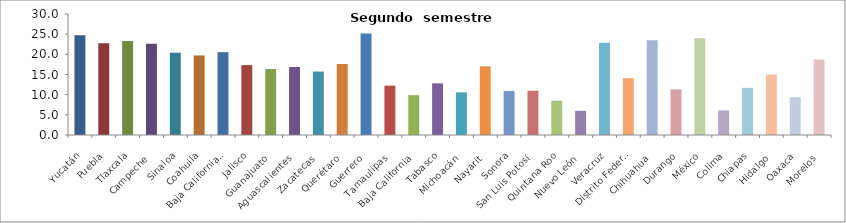
| Category | Segundo semestre 2010 |
|---|---|
| Yucatán | 24.72 |
| Puebla | 22.722 |
| Tlaxcala | 23.312 |
| Campeche | 22.621 |
| Sinaloa | 20.41 |
| Coahuila | 19.724 |
| Baja California Sur | 20.536 |
| Jalisco | 17.337 |
| Guanajuato | 16.345 |
| Aguascalientes | 16.853 |
| Zacatecas | 15.731 |
| Querétaro | 17.607 |
| Guerrero | 25.148 |
| Tamaulipas | 12.237 |
| Baja California | 9.879 |
| Tabasco | 12.805 |
| Michoacán | 10.573 |
| Nayarit | 17.029 |
| Sonora | 10.921 |
| San Luis Potosí | 10.984 |
| Quintana Roo | 8.518 |
| Nuevo León | 6.009 |
| Veracruz | 22.875 |
| Distrito Federal | 14.093 |
| Chihuahua | 23.49 |
| Durango | 11.305 |
| México | 24.006 |
| Colima | 6.099 |
| Chiapas | 11.705 |
| Hidalgo | 14.991 |
| Oaxaca | 9.378 |
| Morelos | 18.727 |